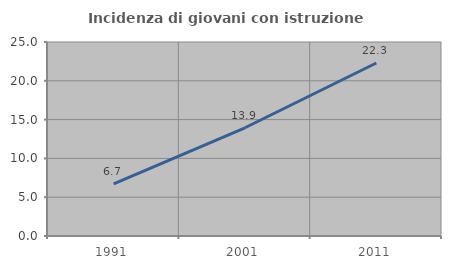
| Category | Incidenza di giovani con istruzione universitaria |
|---|---|
| 1991.0 | 6.711 |
| 2001.0 | 13.948 |
| 2011.0 | 22.297 |